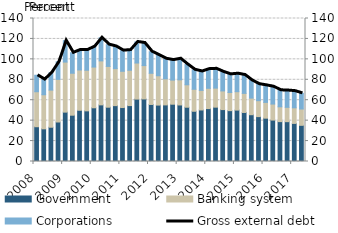
| Category | Government | Banking system | Corporations |
|---|---|---|---|
| 2008.0 | 34.044 | 34.254 | 16.143 |
| 2008.0 | 31.976 | 33.38 | 14.867 |
| 2008.0 | 33.556 | 36.343 | 17.052 |
| 2008.0 | 38.678 | 41.728 | 17.218 |
| 2009.0 | 48.328 | 48.987 | 21.021 |
| 2009.0 | 45.332 | 41.091 | 20.023 |
| 2009.0 | 50.149 | 39.463 | 19.614 |
| 2009.0 | 49.595 | 39.744 | 19.855 |
| 2010.0 | 52.589 | 39.88 | 20.085 |
| 2010.0 | 55.43 | 43.065 | 22.649 |
| 2010.0 | 53.163 | 39.922 | 21.322 |
| 2010.0 | 54.699 | 36.235 | 21.672 |
| 2011.0 | 52.831 | 35.503 | 20.225 |
| 2011.0 | 54.748 | 34.599 | 19.731 |
| 2011.0 | 61.083 | 35.327 | 20.637 |
| 2011.0 | 61.241 | 32.653 | 22.099 |
| 2012.0 | 55.844 | 30.529 | 21.129 |
| 2012.0 | 55.227 | 28.703 | 20.2 |
| 2012.0 | 55.4 | 25.565 | 19.59 |
| 2012.0 | 56.085 | 23.62 | 19.57 |
| 2013.0 | 55.342 | 24.634 | 20.65 |
| 2013.0 | 53.144 | 21.95 | 19.846 |
| 2013.0 | 49.192 | 21.525 | 19.065 |
| 2013.0 | 50.455 | 19.181 | 18.518 |
| 2014.0 | 51.807 | 19.864 | 18.764 |
| 2014.0 | 53.198 | 18.645 | 18.886 |
| 2014.0 | 50.825 | 18.272 | 18.594 |
| 2014.0 | 49.788 | 17.749 | 17.761 |
| 2015.0 | 50.336 | 18.002 | 17.635 |
| 2015.0 | 48.005 | 18.677 | 17.961 |
| 2015.0 | 45.793 | 16.275 | 17.227 |
| 2015.0 | 43.942 | 15.595 | 16.158 |
| 2016.0 | 42.428 | 15.437 | 16.67 |
| 2016.0 | 40.549 | 15.678 | 16.921 |
| 2016.0 | 39.051 | 14.492 | 16.149 |
| 2016.0 | 38.997 | 14.05 | 16.416 |
| 2017.0 | 37.295 | 15.258 | 16.314 |
| 2017.0 | 35.415 | 15.988 | 15.295 |